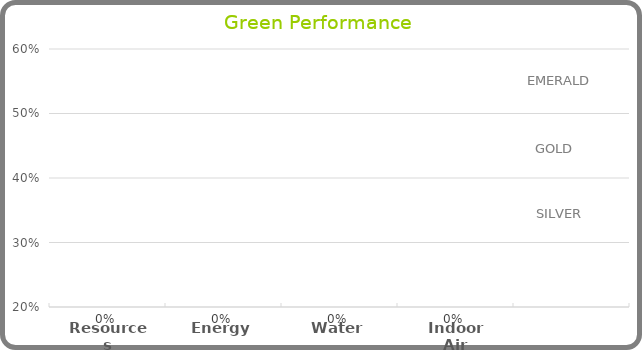
| Category | Green Performance |
|---|---|
| Resources | 0 |
| Energy | 0 |
| Water | 0 |
| Indoor Air | 0 |